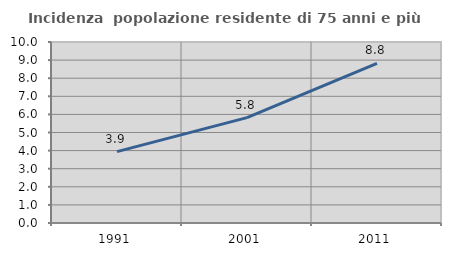
| Category | Incidenza  popolazione residente di 75 anni e più |
|---|---|
| 1991.0 | 3.943 |
| 2001.0 | 5.824 |
| 2011.0 | 8.813 |